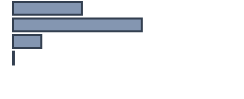
| Category | Series 0 |
|---|---|
| 0 | 30.377 |
| 1 | 56.761 |
| 2 | 12.435 |
| 3 | 0.427 |
| 4 | 0 |